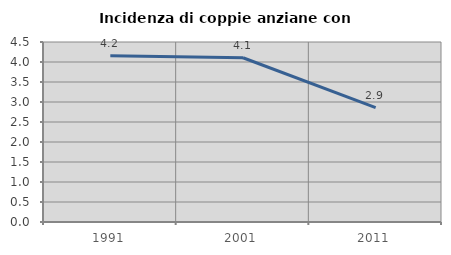
| Category | Incidenza di coppie anziane con figli |
|---|---|
| 1991.0 | 4.153 |
| 2001.0 | 4.106 |
| 2011.0 | 2.857 |